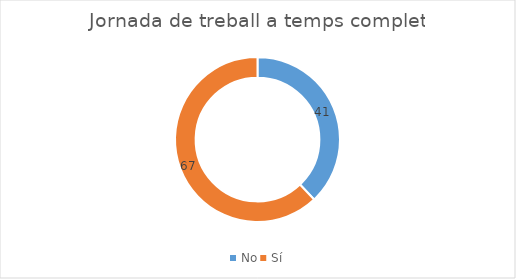
| Category | Series 0 |
|---|---|
| No | 41 |
| Sí | 67 |